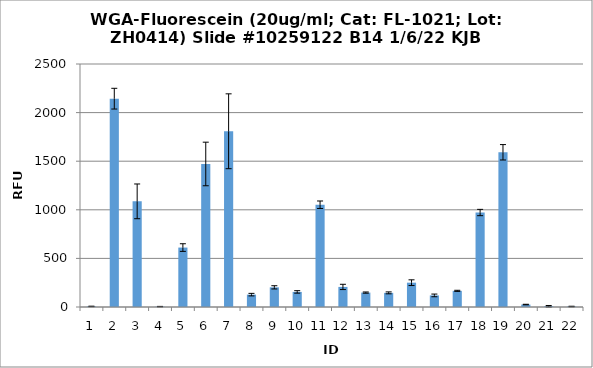
| Category | Series 0 |
|---|---|
| 0 | 6 |
| 1 | 2143.25 |
| 2 | 1087 |
| 3 | 4 |
| 4 | 611.5 |
| 5 | 1471.5 |
| 6 | 1808 |
| 7 | 127.25 |
| 8 | 202.25 |
| 9 | 155.25 |
| 10 | 1052 |
| 11 | 206.5 |
| 12 | 148.25 |
| 13 | 145.5 |
| 14 | 250.25 |
| 15 | 119.25 |
| 16 | 166.25 |
| 17 | 972 |
| 18 | 1591.75 |
| 19 | 25.25 |
| 20 | 8 |
| 21 | 5 |